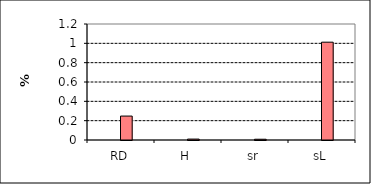
| Category | Series 1 | Series 0 | Series 5 | Series 6 |
|---|---|---|---|---|
| RD |  |  | 0.248 |  |
| H |  |  | 0.01 |  |
| sr |  |  | 0.008 |  |
| sL |  |  | 1.012 |  |